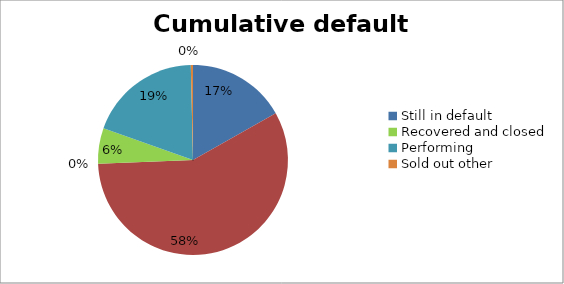
| Category | Series 0 |
|---|---|
| Still in default | 0.168 |
| NPL sold out | 0.576 |
| Written off to bad debt | 0 |
| Recovered and closed | 0.061 |
| Performing | 0.192 |
| Sold out other | 0.004 |